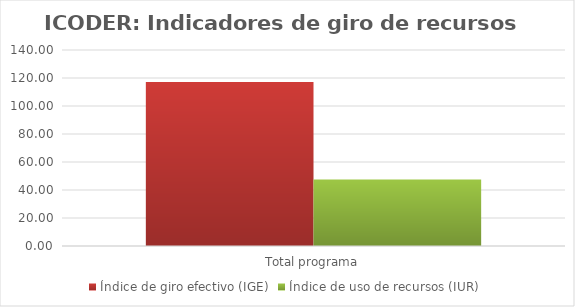
| Category | Índice de giro efectivo (IGE) | Índice de uso de recursos (IUR)  |
|---|---|---|
| Total programa | 117.168 | 47.54 |